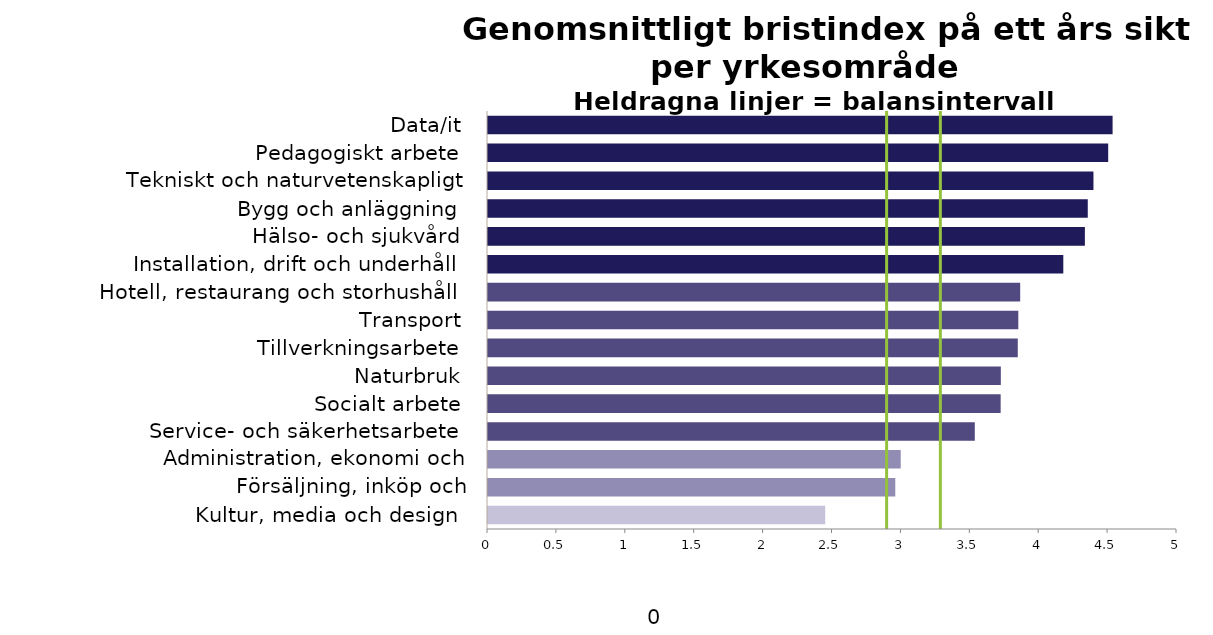
| Category | Series 0 |
|---|---|
| Kultur, media och design | 2.447 |
| Försäljning, inköp och marknadsföring | 2.956 |
| Administration, ekonomi och juridik | 2.995 |
| Service- och säkerhetsarbete | 3.533 |
| Socialt arbete | 3.72 |
| Naturbruk | 3.722 |
| Tillverkningsarbete | 3.844 |
| Transport | 3.848 |
| Hotell, restaurang och storhushåll | 3.862 |
| Installation, drift och underhåll | 4.175 |
| Hälso- och sjukvård | 4.332 |
| Bygg och anläggning | 4.352 |
| Tekniskt och naturvetenskapligt arbete | 4.394 |
| Pedagogiskt arbete | 4.501 |
| Data/it | 4.533 |